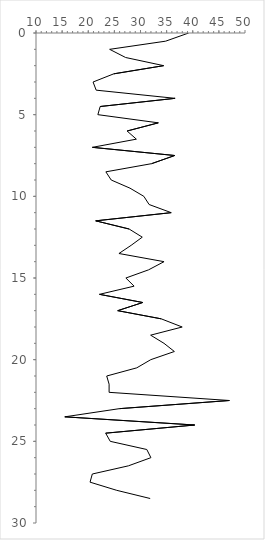
| Category | Series 0 |
|---|---|
| 39.21684842737474 | 0 |
| 34.81481481481482 | 0.5 |
| 24.09547638905437 | 1 |
| 27.153891859774216 | 1.5 |
| 34.433621933621936 | 2 |
| 24.882260596546313 | 2.5 |
| 20.922832400545374 | 3 |
| 21.518365999443983 | 3.5 |
| 36.62263662263663 | 4 |
| 22.282282282282285 | 4.5 |
| 21.840193704600484 | 5 |
| 33.41501197014505 | 5.5 |
| 27.436914936914935 | 6 |
| 29.20875420875421 | 6.5 |
| 20.79017653573057 | 7 |
| 36.55033829249857 | 7.5 |
| 32.12488336163248 | 8 |
| 23.37121212121212 | 8.5 |
| 24.393939393939394 | 9 |
| 27.987689393939394 | 9.5 |
| 30.63973063973064 | 10 |
| 31.645021645021643 | 10.5 |
| 35.8787539115408 | 11 |
| 21.42767767767768 | 11.5 |
| 27.822183184502027 | 12 |
| 30.33910533910534 | 12.5 |
| 28.208440999138674 | 13 |
| 25.87484035759898 | 13.5 |
| 34.50583574258486 | 14 |
| 31.546840958605667 | 14.5 |
| 27.20320113588693 | 15 |
| 28.77492877492877 | 15.5 |
| 22.145877378435518 | 16 |
| 30.43043043043043 | 16.5 |
| 25.64102564102564 | 17 |
| 33.96825396825397 | 17.5 |
| 37.97979797979798 | 18 |
| 31.939062758734888 | 18.5 |
| 34.498834498834505 | 19 |
| 36.48379503892812 | 19.5 |
| 31.96934202962056 | 20 |
| 29.288140768731626 | 20.5 |
| 23.53425559947299 | 21 |
| 23.989845568013536 | 21.5 |
| 23.991254223812366 | 22 |
| 47.014479773100454 | 22.5 |
| 25.95605423094904 | 23 |
| 15.51012832102244 | 23.5 |
| 40.370370370370374 | 24 |
| 23.333333333333332 | 24.5 |
| 24.208398354376502 | 25 |
| 31.20680489101542 | 25.5 |
| 31.993265993265993 | 26 |
| 27.68518518518518 | 26.5 |
| 20.77532077532078 | 27 |
| 20.346320346320347 | 27.5 |
| 25.45537340619308 | 28 |
| 31.85185185185185 | 28.5 |